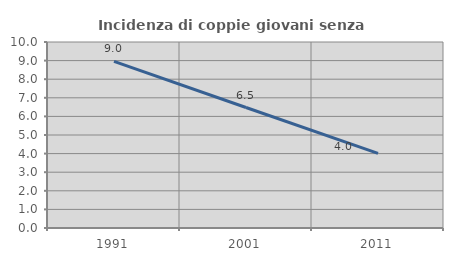
| Category | Incidenza di coppie giovani senza figli |
|---|---|
| 1991.0 | 8.962 |
| 2001.0 | 6.478 |
| 2011.0 | 4.016 |